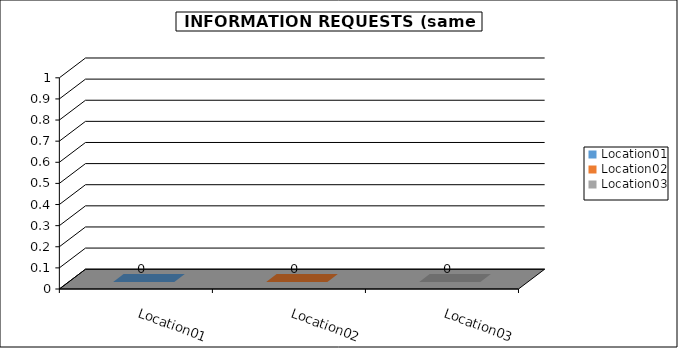
| Category | Data A |
|---|---|
| Location01 | 0 |
| Location02 | 0 |
| Location03 | 0 |